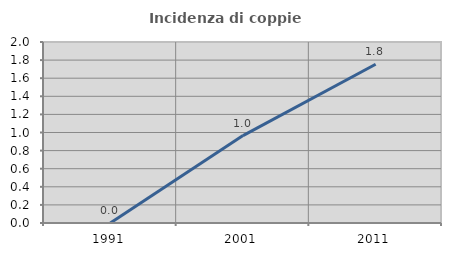
| Category | Incidenza di coppie miste |
|---|---|
| 1991.0 | 0 |
| 2001.0 | 0.966 |
| 2011.0 | 1.754 |